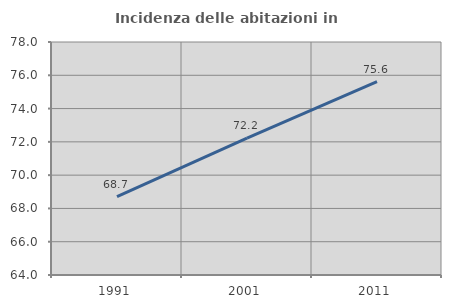
| Category | Incidenza delle abitazioni in proprietà  |
|---|---|
| 1991.0 | 68.703 |
| 2001.0 | 72.223 |
| 2011.0 | 75.621 |